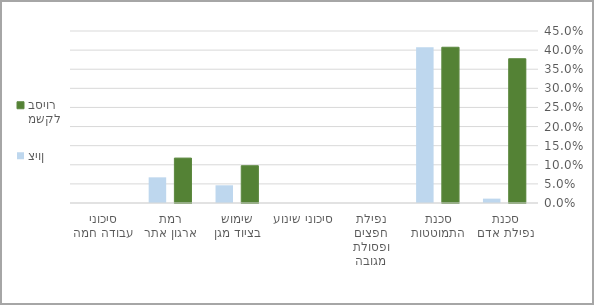
| Category | משקל בסיור | ציון |
|---|---|---|
| סכנת נפילת אדם | 0.378 | 0.011 |
| סכנת התמוטטות | 0.408 | 0.408 |
| נפילת חפצים ופסולת מגובה | 0 | 0 |
| סיכוני שינוע | 0 | 0 |
| שימוש בציוד מגן | 0.098 | 0.046 |
| רמת ארגון אתר | 0.118 | 0.067 |
| סיכוני עבודה חמה | 0 | 0 |